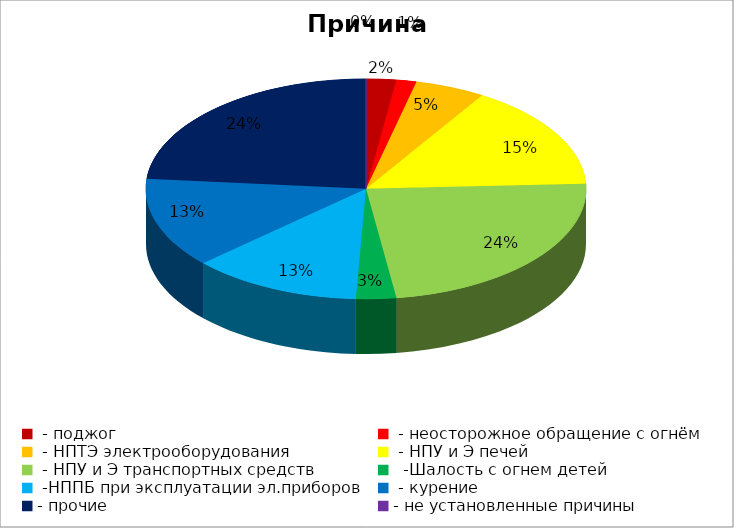
| Category | Причина пожара |
|---|---|
|  - поджог | 3 |
|  - неосторожное обращение с огнём | 2 |
|  - НПТЭ электрооборудования | 7 |
|  - НПУ и Э печей | 21 |
|  - НПУ и Э транспортных средств | 32 |
|   -Шалость с огнем детей | 4 |
|  -НППБ при эксплуатации эл.приборов | 17 |
|  - курение | 18 |
| - прочие | 32 |
| - не установленные причины | 0 |